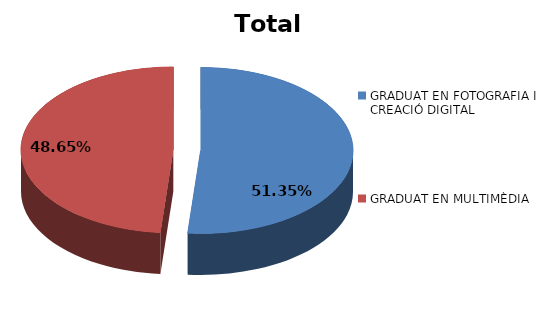
| Category | Series 0 |
|---|---|
| GRADUAT EN FOTOGRAFIA I CREACIÓ DIGITAL | 19 |
| GRADUAT EN MULTIMÈDIA | 18 |